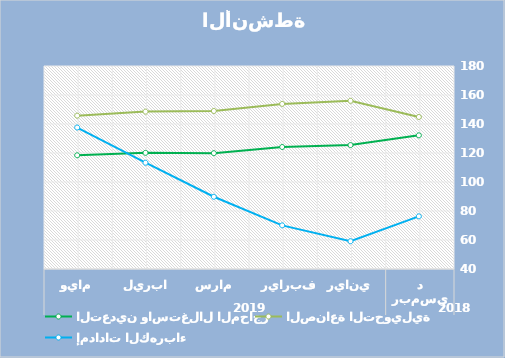
| Category | التعدين واستغلال المحاجر | الصناعة التحويلية | إمدادات الكهرباء |
|---|---|---|---|
| 0 | 132.18 | 144.85 | 76.31 |
| 1 | 125.45 | 155.98 | 59.15 |
| 2 | 124.14 | 153.87 | 70.1 |
| 3 | 119.87 | 148.98 | 89.82 |
| 4 | 120.11 | 148.54 | 113.29 |
| 5 | 118.43 | 145.76 | 137.57 |